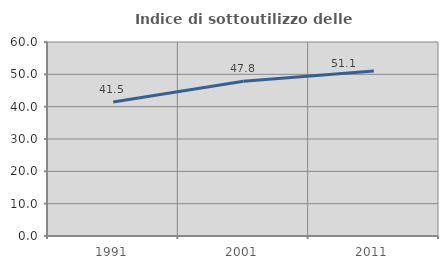
| Category | Indice di sottoutilizzo delle abitazioni  |
|---|---|
| 1991.0 | 41.455 |
| 2001.0 | 47.84 |
| 2011.0 | 51.064 |